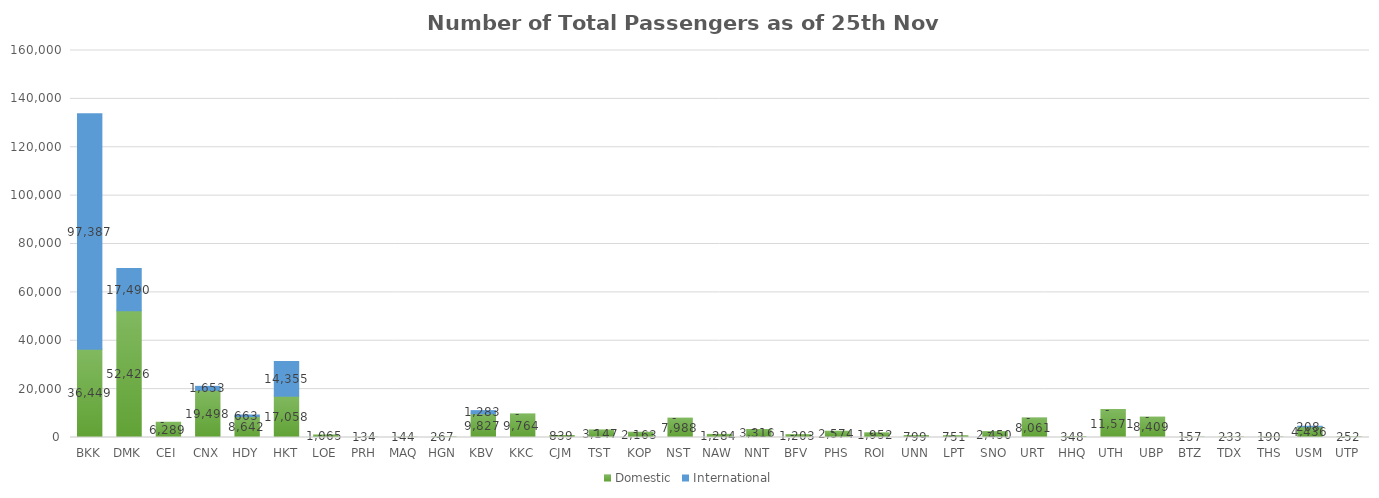
| Category | Domestic | International |
|---|---|---|
| BKK | 36449 | 97387 |
| DMK | 52426 | 17490 |
| CEI | 6289 | 0 |
| CNX | 19498 | 1653 |
| HDY | 8642 | 663 |
| HKT | 17058 | 14355 |
| LOE | 1065 | 0 |
| PRH | 134 | 0 |
| MAQ | 144 | 0 |
| HGN | 267 | 0 |
| KBV | 9827 | 1283 |
| KKC | 9764 | 0 |
| CJM | 839 | 0 |
| TST | 3147 | 0 |
| KOP | 2163 | 0 |
| NST | 7988 | 0 |
| NAW | 1284 | 0 |
| NNT | 3316 | 0 |
| BFV | 1203 | 0 |
| PHS | 2574 | 0 |
| ROI | 1952 | 0 |
| UNN | 799 | 0 |
| LPT | 751 | 0 |
| SNO | 2450 | 0 |
| URT | 8061 | 0 |
| HHQ | 348 | 0 |
| UTH | 11571 | 0 |
| UBP | 8409 | 0 |
| BTZ | 157 | 0 |
| TDX | 233 | 0 |
| THS | 190 | 0 |
| USM | 4436 | 208 |
| UTP | 252 | 0 |